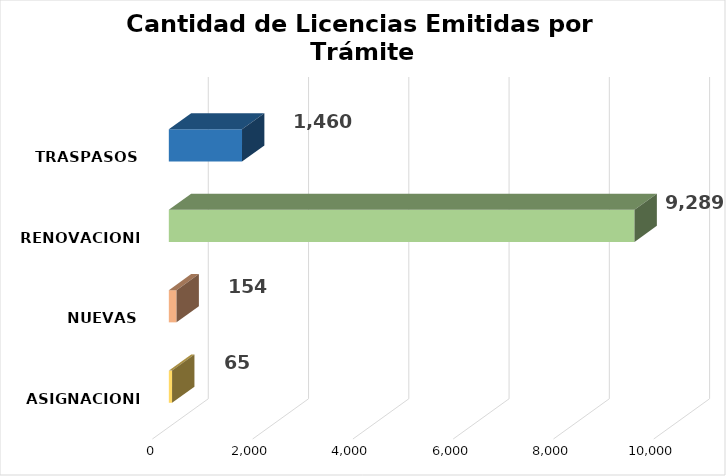
| Category | Series 0 |
|---|---|
| ASIGNACIONES | 65 |
| NUEVAS | 154 |
| RENOVACIONES | 9289 |
| TRASPASOS | 1460 |